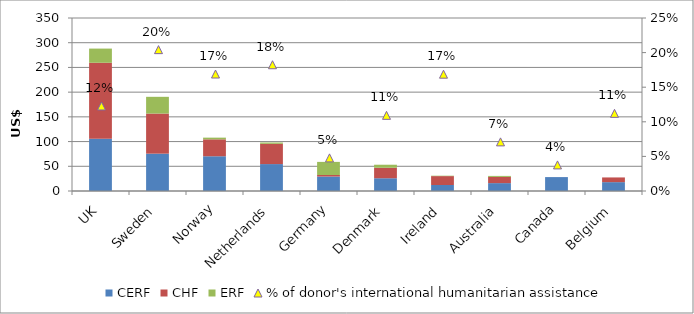
| Category | CERF | CHF | ERF |
|---|---|---|---|
| UK | 105.548 | 153.899 | 28.67 |
| Sweden | 75.542 | 81.114 | 33.878 |
| Norway | 70.283 | 34.245 | 3.435 |
| Netherlands | 54.461 | 41.009 | 2.65 |
| Germany | 29.253 | 3.153 | 26.475 |
| Denmark | 25.805 | 21.182 | 6.163 |
| Ireland | 12.167 | 17.964 | 0.812 |
| Australia | 15.933 | 12.59 | 1.998 |
| Canada | 28.145 | 0 | 0 |
| Belgium | 17.922 | 9.509 | 0 |